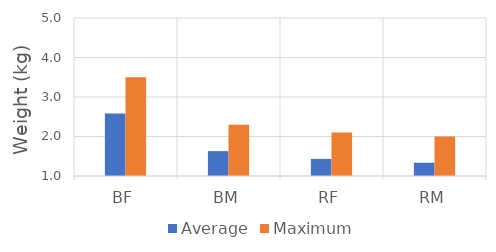
| Category | Average | Maximum |
|---|---|---|
| BF | 2.585 | 3.5 |
| BM | 1.63 | 2.3 |
| RF | 1.433 | 2.1 |
| RM | 1.336 | 2 |